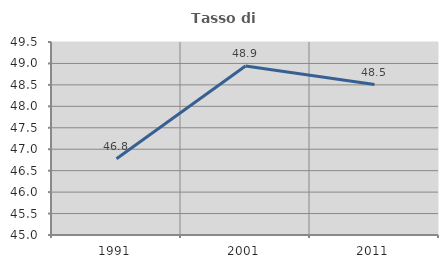
| Category | Tasso di occupazione   |
|---|---|
| 1991.0 | 46.776 |
| 2001.0 | 48.939 |
| 2011.0 | 48.509 |